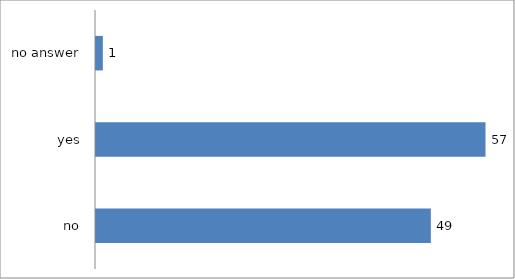
| Category | Series 0 |
|---|---|
| no | 49 |
| yes | 57 |
| no answer | 1 |